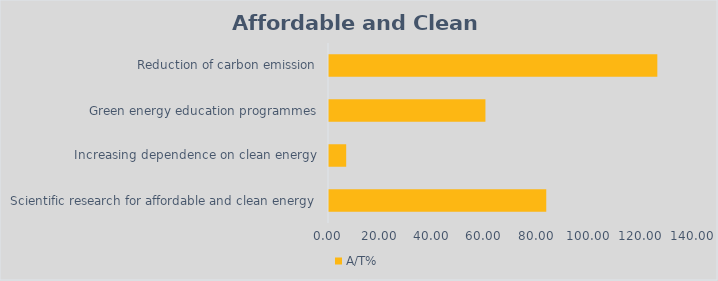
| Category | A/T% |
|---|---|
| Scientific research for affordable and clean energy | 83.333 |
| Increasing dependence on clean energy | 6.594 |
| Green energy education programmes | 60 |
| Reduction of carbon emission | 125.933 |